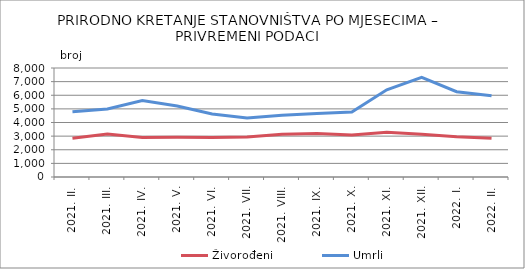
| Category | Živorođeni | Umrli |
|---|---|---|
| 2021. II. | 2844 | 4790 |
| 2021. III. | 3155 | 4985 |
| 2021. IV. | 2894 | 5615 |
| 2021. V. | 2913 | 5210 |
| 2021. VI. | 2899 | 4629 |
| 2021. VII. | 2930 | 4334 |
| 2021. VIII. | 3139 | 4532 |
| 2021. IX. | 3191 | 4660 |
| 2021. X. | 3089 | 4764 |
| 2021. XI. | 3276 | 6396 |
| 2021. XII. | 3141 | 7313 |
| 2022. I. | 2949 | 6262 |
| 2022. II. | 2839 | 5956 |